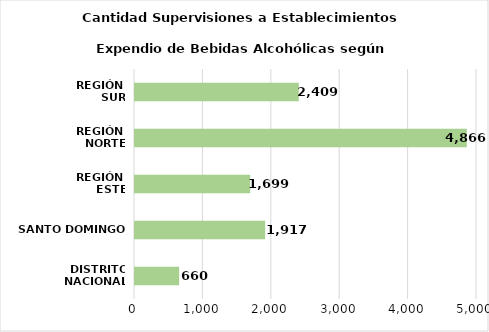
| Category | Series 0 |
|---|---|
| DISTRITO NACIONAL | 660 |
| SANTO DOMINGO | 1917 |
| REGIÓN 
ESTE | 1699 |
| REGIÓN 
NORTE | 4866 |
| REGIÓN 
SUR | 2409 |